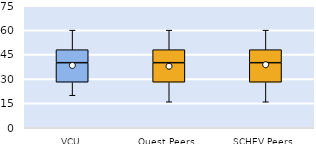
| Category | 25th | 50th | 75th |
|---|---|---|---|
| VCU | 28 | 12 | 8 |
| Quest Peers | 28 | 12 | 8 |
| SCHEV Peers | 28 | 12 | 8 |